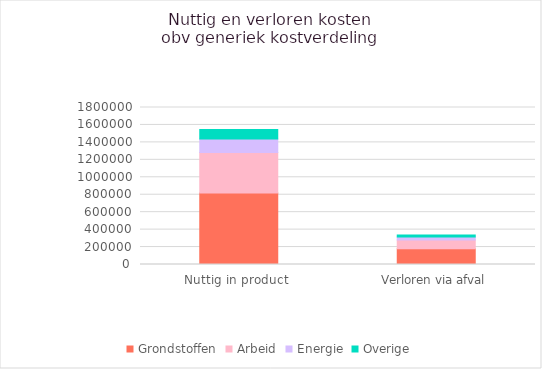
| Category | Grondstoffen | Arbeid | Energie | Overige |
|---|---|---|---|---|
| Nuttig in product  | 820000 | 464150.943 | 154716.981 | 108301.887 |
| Verloren via afval | 180000 | 101886.792 | 33962.264 | 23773.585 |